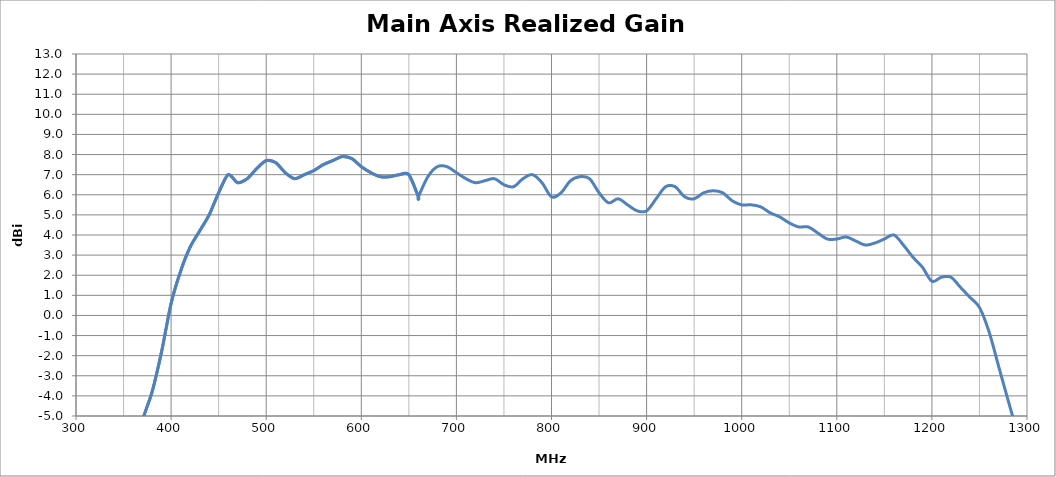
| Category | Main Axis Realized Gain (dBi) |
|---|---|
| 300.0 | -18.9 |
| 310.0 | -21.4 |
| 320.0 | -19.6 |
| 330.0 | -13 |
| 340.0 | -10.7 |
| 350.0 | -8.9 |
| 360.0 | -7.1 |
| 370.0 | -5.2 |
| 380.0 | -3.8 |
| 390.0 | -1.8 |
| 400.0 | 0.6 |
| 410.0 | 2.2 |
| 420.0 | 3.4 |
| 430.0 | 4.2 |
| 440.0 | 5 |
| 450.0 | 6.1 |
| 460.0 | 7 |
| 470.0 | 6.6 |
| 480.0 | 6.8 |
| 490.0 | 7.3 |
| 500.0 | 7.7 |
| 510.0 | 7.6 |
| 520.0 | 7.1 |
| 530.0 | 6.8 |
| 540.0 | 7 |
| 550.0 | 7.2 |
| 560.0 | 7.5 |
| 570.0 | 7.7 |
| 580.0 | 7.9 |
| 590.0 | 7.8 |
| 600.0 | 7.4 |
| 610.0 | 7.1 |
| 620.0 | 6.9 |
| 630.0 | 6.9 |
| 640.0 | 7 |
| 650.0 | 7 |
| 660.0 | 5.9 |
| 670.0 | 6.9 |
| 680.0 | 7.4 |
| 690.0 | 7.4 |
| 700.0 | 7.1 |
| 710.0 | 6.8 |
| 720.0 | 6.6 |
| 730.0 | 6.7 |
| 740.0 | 6.8 |
| 750.0 | 6.5 |
| 760.0 | 6.4 |
| 770.0 | 6.8 |
| 780.0 | 7 |
| 790.0 | 6.6 |
| 800.0 | 5.9 |
| 810.0 | 6.1 |
| 820.0 | 6.7 |
| 830.0 | 6.9 |
| 840.0 | 6.8 |
| 850.0 | 6.1 |
| 860.0 | 5.6 |
| 870.0 | 5.8 |
| 880.0 | 5.5 |
| 890.0 | 5.2 |
| 900.0 | 5.2 |
| 910.0 | 5.8 |
| 920.0 | 6.4 |
| 930.0 | 6.4 |
| 940.0 | 5.9 |
| 950.0 | 5.8 |
| 960.0 | 6.1 |
| 970.0 | 6.2 |
| 980.0 | 6.1 |
| 990.0 | 5.7 |
| 1000.0 | 5.5 |
| 1010.0 | 5.5 |
| 1020.0 | 5.4 |
| 1030.0 | 5.1 |
| 1040.0 | 4.9 |
| 1050.0 | 4.6 |
| 1060.0 | 4.4 |
| 1070.0 | 4.4 |
| 1080.0 | 4.1 |
| 1090.0 | 3.8 |
| 1100.0 | 3.8 |
| 1110.0 | 3.9 |
| 1120.0 | 3.7 |
| 1130.0 | 3.5 |
| 1140.0 | 3.6 |
| 1150.0 | 3.8 |
| 1160.0 | 4 |
| 1170.0 | 3.5 |
| 1180.0 | 2.9 |
| 1190.0 | 2.4 |
| 1200.0 | 1.7 |
| 1210.0 | 1.9 |
| 1220.0 | 1.9 |
| 1230.0 | 1.4 |
| 1240.0 | 0.9 |
| 1250.0 | 0.4 |
| 1260.0 | -0.8 |
| 1270.0 | -2.5 |
| 1280.0 | -4.2 |
| 1290.0 | -5.8 |
| 1300.0 | -7 |